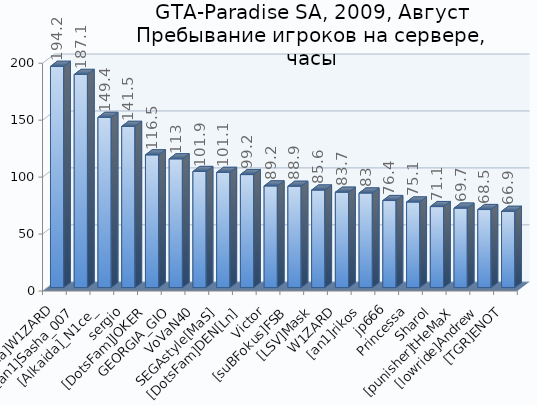
| Category | Series 0 |
|---|---|
| [Alkaida]W1ZARD | 194.2 |
| [an1]Sasha_007 | 187.1 |
| [Alkaida]_N1ce_ | 149.4 |
| sergio | 141.5 |
| [DotsFam]JOKER | 116.5 |
| GEORGIA_GIO | 113 |
| VoVaN40 | 101.9 |
| SEGAstyle[MaS] | 101.1 |
| [DotsFam]DEN[Ln] | 99.2 |
| Victor | 89.2 |
| [suBFokus]FSB | 88.9 |
| [LSV]Mask | 85.6 |
| W1ZARD | 83.7 |
| [an1]rikos | 83 |
| jp666 | 76.4 |
| Princessa | 75.1 |
| Sharol | 71.1 |
| [punisher]tHeMaX | 69.7 |
| [lowride]Andrew | 68.5 |
| [TGR]ENOT | 66.9 |